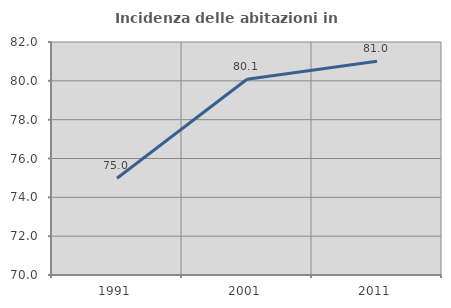
| Category | Incidenza delle abitazioni in proprietà  |
|---|---|
| 1991.0 | 74.981 |
| 2001.0 | 80.084 |
| 2011.0 | 81.009 |